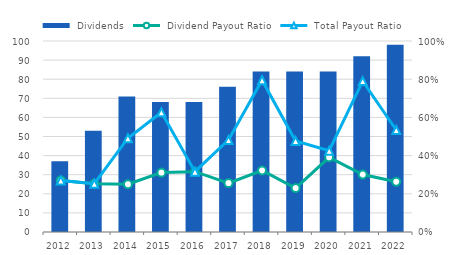
| Category |  Dividends |
|---|---|
| 2012.0 | 37 |
| 2013.0 | 53 |
| 2014.0 | 71 |
| 2015.0 | 68 |
| 2016.0 | 68 |
| 2017.0 | 76 |
| 2018.0 | 84 |
| 2019.0 | 84 |
| 2020.0 | 84 |
| 2021.0 | 92 |
| 2022.0 | 98 |